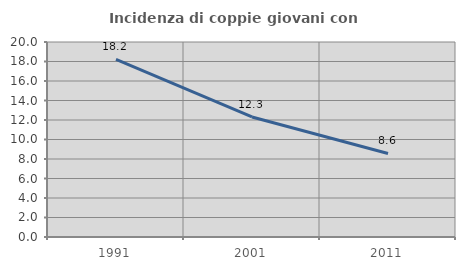
| Category | Incidenza di coppie giovani con figli |
|---|---|
| 1991.0 | 18.223 |
| 2001.0 | 12.31 |
| 2011.0 | 8.566 |